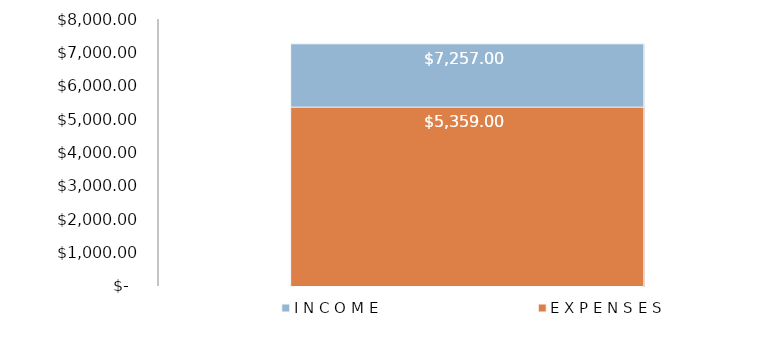
| Category | I N C O M E | E X P E N S E S |
|---|---|---|
| 0 | 7257 | 5359 |